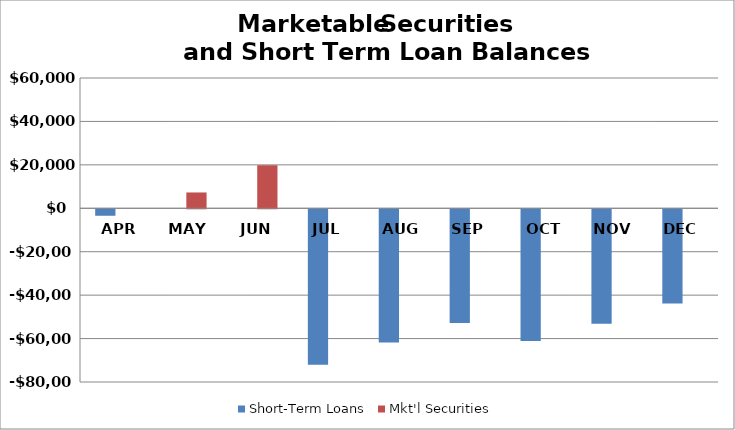
| Category | Short-Term Loans | Mkt'l Securities |
|---|---|---|
| APR | -2987.5 | 0 |
| MAY | 0 | 7287 |
| JUN | 0 | 19769.5 |
| JUL | -71643 | 0 |
| AUG | -61310.5 | 0 |
| SEP | -52408 | 0 |
| OCT | -60617.5 | 0 |
| NOV | -52717 | 0 |
| DEC | -43389.5 | 0 |